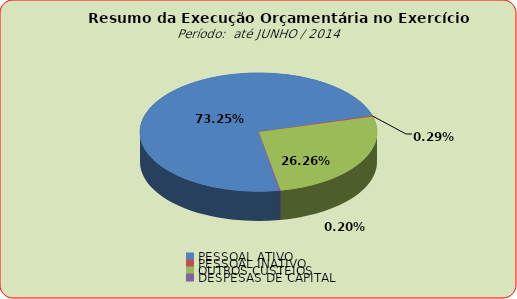
| Category | Series 0 |
|---|---|
| PESSOAL ATIVO | 58860467.33 |
| PESSOAL INATIVO | 231513.9 |
| OUTROS CUSTEIOS | 21101437.33 |
| DESPESAS DE CAPITAL | 157798.17 |